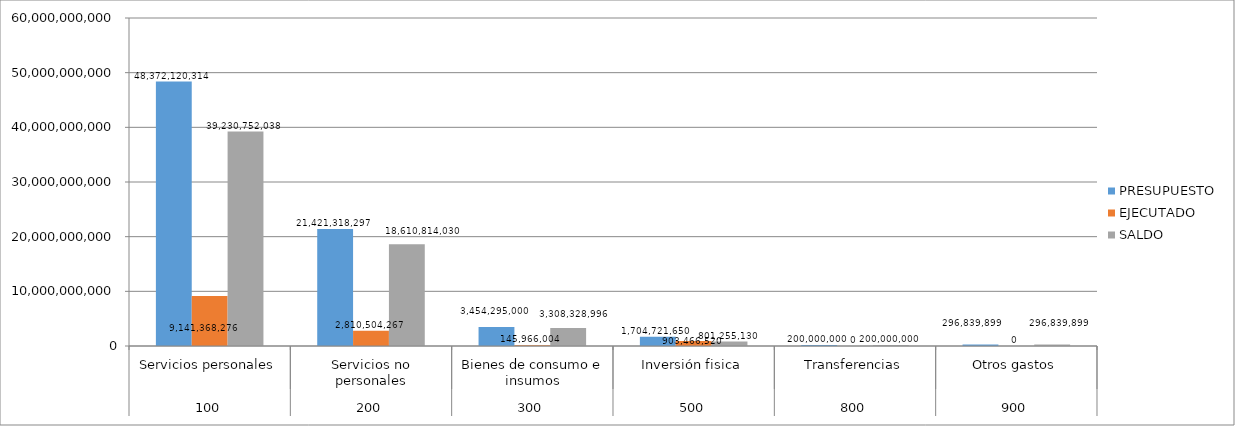
| Category | PRESUPUESTO | EJECUTADO | SALDO |
|---|---|---|---|
| 0 | 48372120314 | 9141368276 | 39230752038 |
| 1 | 21421318297 | 2810504267 | 18610814030 |
| 2 | 3454295000 | 145966004 | 3308328996 |
| 3 | 1704721650 | 903466520 | 801255130 |
| 4 | 200000000 | 0 | 200000000 |
| 5 | 296839899 | 0 | 296839899 |